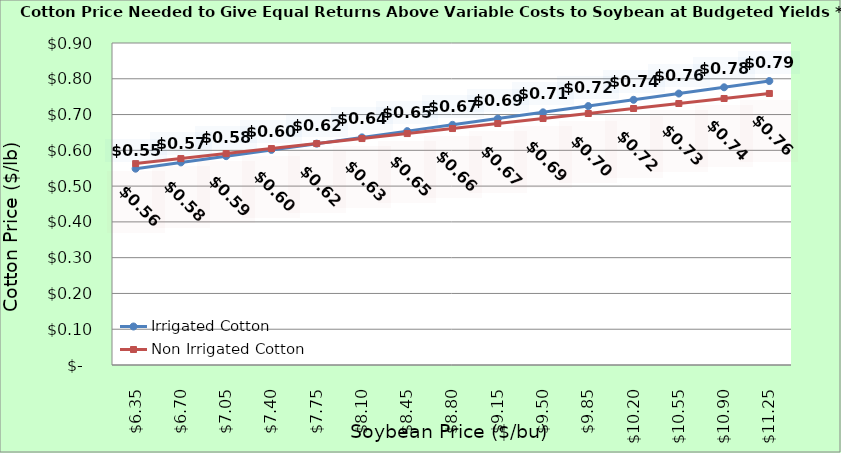
| Category | Irrigated Cotton | Non Irrigated Cotton |
|---|---|---|
| 6.350000000000003 | 0.549 | 0.563 |
| 6.700000000000003 | 0.566 | 0.577 |
| 7.0500000000000025 | 0.584 | 0.591 |
| 7.400000000000002 | 0.601 | 0.605 |
| 7.750000000000002 | 0.619 | 0.619 |
| 8.100000000000001 | 0.636 | 0.633 |
| 8.450000000000001 | 0.654 | 0.647 |
| 8.8 | 0.671 | 0.661 |
| 9.15 | 0.689 | 0.675 |
| 9.5 | 0.706 | 0.689 |
| 9.85 | 0.724 | 0.703 |
| 10.2 | 0.741 | 0.717 |
| 10.549999999999999 | 0.759 | 0.731 |
| 10.899999999999999 | 0.776 | 0.745 |
| 11.249999999999998 | 0.794 | 0.759 |